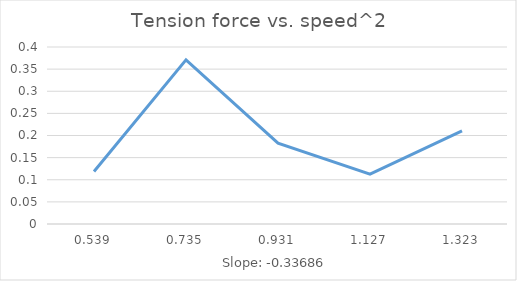
| Category | Series 0 |
|---|---|
| 0.539 | 0.119 |
| 0.735 | 0.371 |
| 0.931 | 0.183 |
| 1.127 | 0.113 |
| 1.323 | 0.21 |